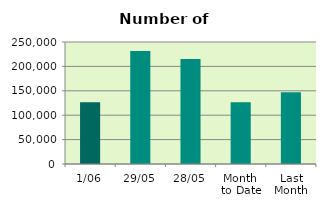
| Category | Series 0 |
|---|---|
| 1/06 | 126644 |
| 29/05 | 231556 |
| 28/05 | 215148 |
| Month 
to Date | 126644 |
| Last
Month | 147277.8 |